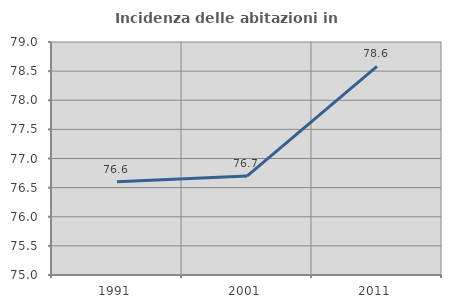
| Category | Incidenza delle abitazioni in proprietà  |
|---|---|
| 1991.0 | 76.603 |
| 2001.0 | 76.698 |
| 2011.0 | 78.583 |